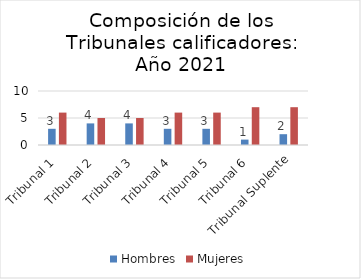
| Category | Hombres | Mujeres |
|---|---|---|
| Tribunal 1 | 3 | 6 |
| Tribunal 2 | 4 | 5 |
| Tribunal 3 | 4 | 5 |
| Tribunal 4 | 3 | 6 |
| Tribunal 5 | 3 | 6 |
| Tribunal 6 | 1 | 7 |
| Tribunal Suplente | 2 | 7 |